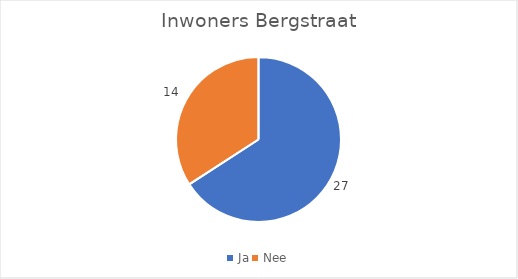
| Category | Series 0 |
|---|---|
| Ja | 27 |
| Nee | 14 |